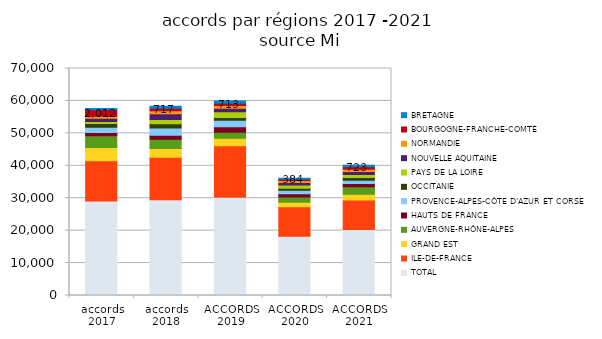
| Category | TOTAL | ILE-DE-FRANCE | GRAND EST | AUVERGNE-RHÔNE-ALPES | HAUTS DE FRANCE | PROVENCE-ALPES-CÔTE D'AZUR ET CORSE | OCCITANIE | PAYS DE LA LOIRE | NOUVELLE AQUITAINE | NORMANDIE | BOURGOGNE-FRANCHE-COMTÉ | BRETAGNE |
|---|---|---|---|---|---|---|---|---|---|---|---|---|
| accords 2017 | 29113 | 12404 | 4102 | 3605 | 1076 | 1600 | 1136 | 637 | 948 | 645 | 2012 | 356 |
| accords 2018 | 29536 | 13066 | 2739 | 2842 | 1249 | 2248 | 1245 | 1338 | 1815 | 914 | 717 | 650 |
| ACCORDS 2019 | 30267 | 15932 | 2306 | 1837 | 1665 | 1997 | 903 | 1760 | 1089 | 838 | 713 | 658 |
| ACCORDS 2020 | 18293 | 9053 | 1441 | 1585 | 1004 | 1045 | 648 | 998 | 748 | 636 | 384 | 353 |
| ACCORDS 2021 | 20350 | 9087 | 1788 | 2303 | 997 | 983 | 914 | 866 | 931 | 748 | 723 | 489 |